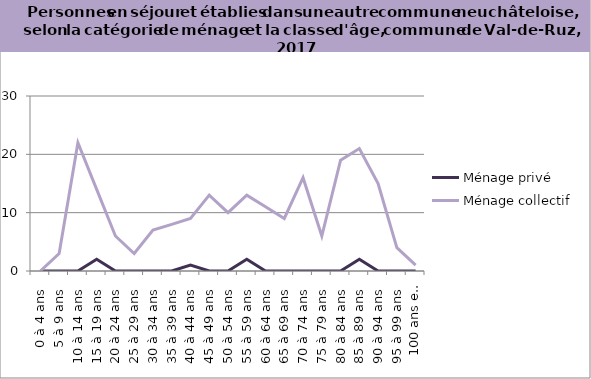
| Category | Ménage privé | Ménage collectif |
|---|---|---|
| 0 à 4 ans | 0 | 0 |
| 5 à 9 ans | 0 | 3 |
| 10 à 14 ans | 0 | 22 |
| 15 à 19 ans | 2 | 14 |
| 20 à 24 ans | 0 | 6 |
| 25 à 29 ans | 0 | 3 |
| 30 à 34 ans | 0 | 7 |
| 35 à 39 ans | 0 | 8 |
| 40 à 44 ans | 1 | 9 |
| 45 à 49 ans | 0 | 13 |
| 50 à 54 ans | 0 | 10 |
| 55 à 59 ans | 2 | 13 |
| 60 à 64 ans | 0 | 11 |
| 65 à 69 ans | 0 | 9 |
| 70 à 74 ans | 0 | 16 |
| 75 à 79 ans | 0 | 6 |
| 80 à 84 ans | 0 | 19 |
| 85 à 89 ans | 2 | 21 |
| 90 à 94 ans | 0 | 15 |
| 95 à 99 ans | 0 | 4 |
| 100 ans et plus | 0 | 1 |